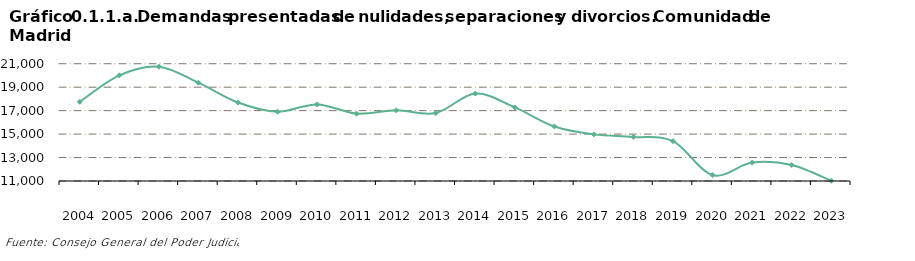
| Category | Series 0 |
|---|---|
|    2004 | 17753 |
|    2005 | 20007 |
|    2006 | 20751 |
|    2007 | 19383 |
|    2008 | 17689 |
|    2009 | 16905 |
|    2010 | 17531 |
|    2011 | 16744 |
|    2012 | 17026 |
|    2013 | 16794 |
|    2014 | 18453 |
|    2015 | 17278 |
|    2016 | 15651 |
|    2017 | 14976 |
|    2018 | 14760 |
|    2019 | 14395 |
|    2020 | 11505 |
|    2021 | 12568 |
|    2022 | 12362 |
|    2023 | 11018 |